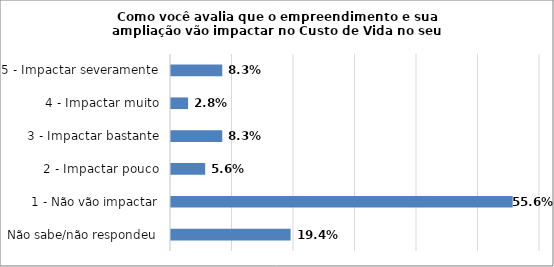
| Category | Series 0 |
|---|---|
| Não sabe/não respondeu | 0.194 |
| 1 - Não vão impactar | 0.556 |
| 2 - Impactar pouco | 0.056 |
| 3 - Impactar bastante | 0.083 |
| 4 - Impactar muito | 0.028 |
| 5 - Impactar severamente | 0.083 |